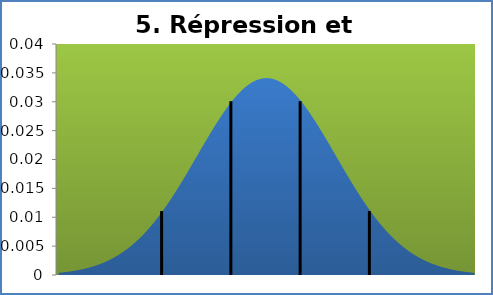
| Category | densité |
|---|---|
| -0.8400000000000034 | 0 |
| -0.25500000000000256 | 0 |
| 0.3300000000000054 | 0.001 |
| 0.9149999999999991 | 0.001 |
| 1.5 | 0.001 |
| 2.085000000000001 | 0.001 |
| 2.6700000000000017 | 0.001 |
| 3.2550000000000026 | 0.001 |
| 3.84 | 0.001 |
| 4.425000000000001 | 0.001 |
| 5.009999999999998 | 0.001 |
| 5.594999999999999 | 0.002 |
| 6.180000000000003 | 0.002 |
| 6.765000000000001 | 0.002 |
| 7.350000000000001 | 0.002 |
| 7.934999999999999 | 0.003 |
| 8.52 | 0.003 |
| 9.105 | 0.003 |
| 9.689999999999998 | 0.004 |
| 10.274999999999999 | 0.004 |
| 10.86 | 0.005 |
| 11.445 | 0.005 |
| 12.030000000000001 | 0.006 |
| 12.614999999999998 | 0.006 |
| 13.2 | 0.007 |
| 13.784999999999997 | 0.007 |
| 14.370000000000001 | 0.008 |
| 14.954999999999998 | 0.009 |
| 15.54 | 0.009 |
| 16.125 | 0.01 |
| 16.709999999999997 | 0.011 |
| 17.295 | 0.012 |
| 17.88 | 0.013 |
| 18.465 | 0.014 |
| 19.049999999999997 | 0.015 |
| 19.634999999999998 | 0.016 |
| 20.22 | 0.017 |
| 20.805 | 0.018 |
| 21.39 | 0.019 |
| 21.974999999999998 | 0.02 |
| 22.56 | 0.021 |
| 23.145 | 0.022 |
| 23.729999999999997 | 0.023 |
| 24.314999999999998 | 0.024 |
| 24.9 | 0.025 |
| 25.485 | 0.026 |
| 26.07 | 0.027 |
| 26.654999999999998 | 0.028 |
| 27.24 | 0.028 |
| 27.825 | 0.029 |
| 28.409999999999997 | 0.03 |
| 28.994999999999997 | 0.031 |
| 29.58 | 0.031 |
| 30.165 | 0.032 |
| 30.75 | 0.033 |
| 31.334999999999997 | 0.033 |
| 31.919999999999998 | 0.033 |
| 32.504999999999995 | 0.034 |
| 33.089999999999996 | 0.034 |
| 33.675 | 0.034 |
| 34.26 | 0.034 |
| 34.845 | 0.034 |
| 35.43 | 0.034 |
| 36.015 | 0.034 |
| 36.599999999999994 | 0.033 |
| 37.184999999999995 | 0.033 |
| 37.769999999999996 | 0.033 |
| 38.355 | 0.032 |
| 38.94 | 0.031 |
| 39.525 | 0.031 |
| 40.11 | 0.03 |
| 40.695 | 0.029 |
| 41.279999999999994 | 0.028 |
| 41.864999999999995 | 0.028 |
| 42.449999999999996 | 0.027 |
| 43.035 | 0.026 |
| 43.62 | 0.025 |
| 44.205 | 0.024 |
| 44.79 | 0.023 |
| 45.375 | 0.022 |
| 45.959999999999994 | 0.021 |
| 46.545 | 0.02 |
| 47.129999999999995 | 0.019 |
| 47.714999999999996 | 0.018 |
| 48.3 | 0.017 |
| 48.885 | 0.016 |
| 49.47 | 0.015 |
| 50.05499999999999 | 0.014 |
| 50.64 | 0.013 |
| 51.224999999999994 | 0.012 |
| 51.81 | 0.011 |
| 52.394999999999996 | 0.01 |
| 52.98 | 0.009 |
| 53.565 | 0.009 |
| 54.14999999999999 | 0.008 |
| 54.735 | 0.007 |
| 55.31999999999999 | 0.007 |
| 55.905 | 0.006 |
| 56.489999999999995 | 0.006 |
| 57.074999999999996 | 0.005 |
| 57.66 | 0.005 |
| 58.245 | 0.004 |
| 58.83 | 0.004 |
| 59.41499999999999 | 0.003 |
| 60.0 | 0.003 |
| 60.584999999999994 | 0.003 |
| 61.169999999999995 | 0.002 |
| 61.754999999999995 | 0.002 |
| 62.33999999999999 | 0.002 |
| 62.925 | 0.002 |
| 63.51 | 0.001 |
| 64.095 | 0.001 |
| 64.67999999999999 | 0.001 |
| 65.26499999999999 | 0.001 |
| 65.85 | 0.001 |
| 66.435 | 0.001 |
| 67.02 | 0.001 |
| 67.60499999999999 | 0.001 |
| 68.19 | 0.001 |
| 68.775 | 0 |
| 69.36 | 0 |